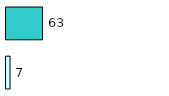
| Category | Series 0 | Series 1 |
|---|---|---|
| 0 | 7 | 63 |